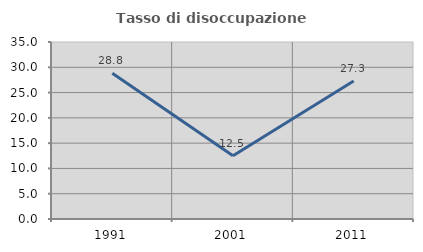
| Category | Tasso di disoccupazione giovanile  |
|---|---|
| 1991.0 | 28.814 |
| 2001.0 | 12.5 |
| 2011.0 | 27.273 |